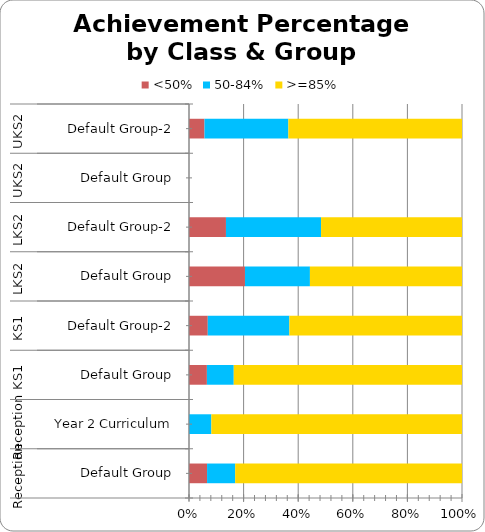
| Category | <50% | 50-84% | >=85% |
|---|---|---|---|
| 0 | 9 | 14 | 113 |
| 1 | 0 | 5 | 56 |
| 2 | 24 | 36 | 306 |
| 3 | 26 | 113 | 239 |
| 4 | 106 | 123 | 288 |
| 5 | 75 | 193 | 286 |
| 6 | 0 | 0 | 0 |
| 7 | 29 | 157 | 325 |